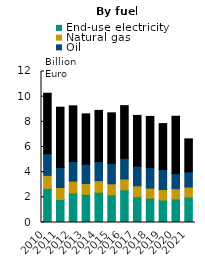
| Category | End-use electricity | Natural gas | Oil | Coal |
|---|---|---|---|---|
| 2010 | 2716.712 | 1031.304 | 1717.009 | 4807.983 |
| 2011 | 1821.734 | 959.805 | 1593.423 | 4786.936 |
| 2012 | 2345.84 | 938.385 | 1565.563 | 4422.798 |
| 2013 | 2235.231 | 857.635 | 1540.75 | 3999.438 |
| 2014 | 2399.841 | 927.368 | 1518.699 | 4061.2 |
| 2015 | 2198.704 | 876.14 | 1629.329 | 4010.832 |
| 2016 | 2593.499 | 865.055 | 1642.577 | 4183.853 |
| 2017 | 2043.479 | 871.988 | 1566.156 | 4028.958 |
| 2018 | 1938.532 | 796.404 | 1628.007 | 4069.349 |
| 2019 | 1784.678 | 832.442 | 1597.709 | 3645.087 |
| 2020 | 1872.098 | 813.632 | 1197.743 | 4559.076 |
| 2021 | 2023.497 | 796.226 | 1213.632 | 2614.369 |